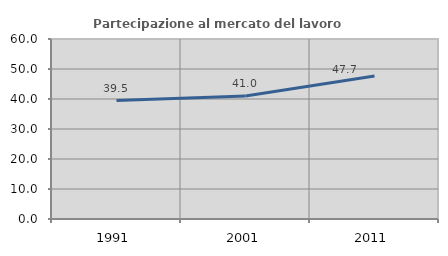
| Category | Partecipazione al mercato del lavoro  femminile |
|---|---|
| 1991.0 | 39.464 |
| 2001.0 | 41.01 |
| 2011.0 | 47.658 |